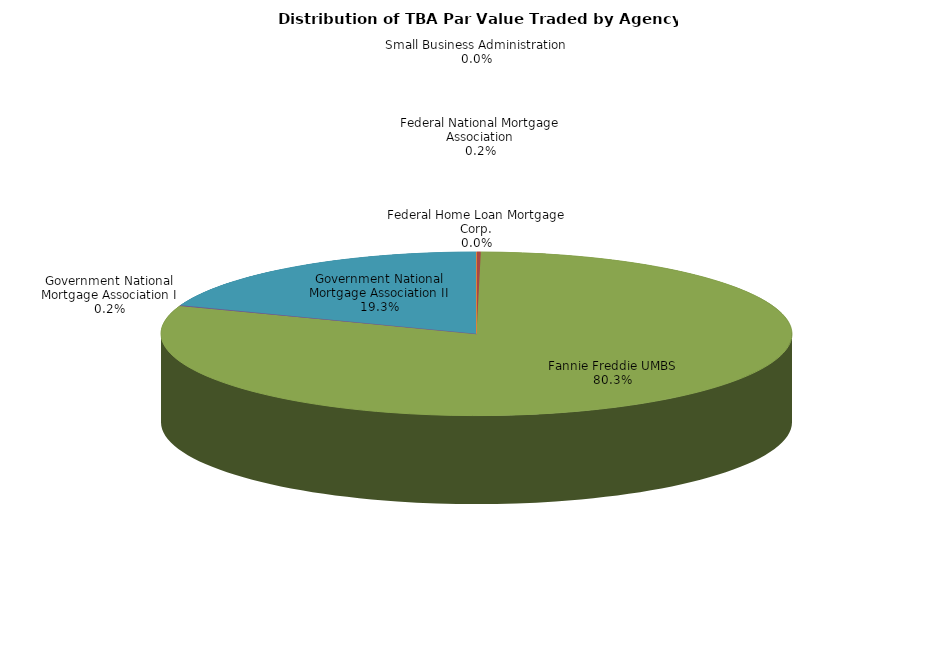
| Category | Series 0 |
|---|---|
| Federal Home Loan Mortgage Corp. | 28079940.447 |
| Federal National Mortgage Association | 545388310.233 |
| Fannie Freddie UMBS | 211506500935.259 |
| Government National Mortgage Association I | 430406363.518 |
| Government National Mortgage Association II | 50925110890.682 |
| Small Business Administration | 0 |